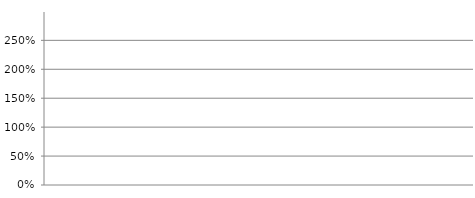
| Category | Selbstfinanzierungsgrad (Selbstfinanzierung / Nettoinvestitionen) |
|---|---|
| 2018.0 | 0 |
| 2019.0 | 0 |
| 2020.0 | 0 |
| 2021.0 | 0 |
| 2022.0 | 0 |